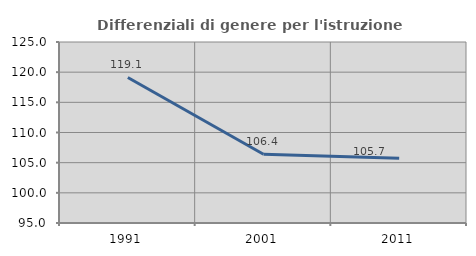
| Category | Differenziali di genere per l'istruzione superiore |
|---|---|
| 1991.0 | 119.125 |
| 2001.0 | 106.388 |
| 2011.0 | 105.715 |